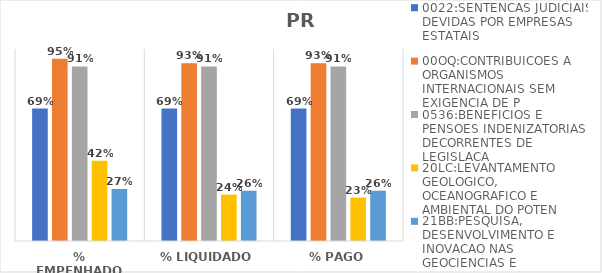
| Category | 0022:SENTENCAS JUDICIAIS DEVIDAS POR EMPRESAS ESTATAIS | 00OQ:CONTRIBUICOES A ORGANISMOS INTERNACIONAIS SEM EXIGENCIA DE P | 0536:BENEFICIOS E PENSOES INDENIZATORIAS DECORRENTES DE LEGISLACA | 20LC:LEVANTAMENTO GEOLOGICO, OCEANOGRAFICO E AMBIENTAL DO POTEN | 21BB:PESQUISA, DESENVOLVIMENTO E INOVACAO NAS GEOCIENCIAS E |
|---|---|---|---|---|---|
| % EMPENHADO | 0.69 | 0.95 | 0.909 | 0.418 | 0.271 |
| % LIQUIDADO | 0.69 | 0.926 | 0.909 | 0.242 | 0.262 |
| % PAGO | 0.689 | 0.926 | 0.909 | 0.226 | 0.262 |